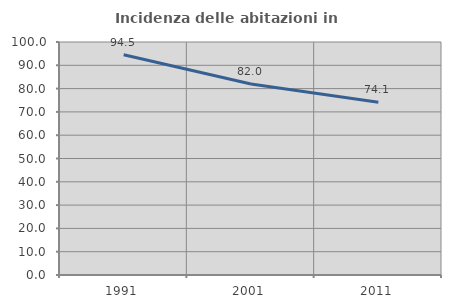
| Category | Incidenza delle abitazioni in proprietà  |
|---|---|
| 1991.0 | 94.545 |
| 2001.0 | 82 |
| 2011.0 | 74.138 |